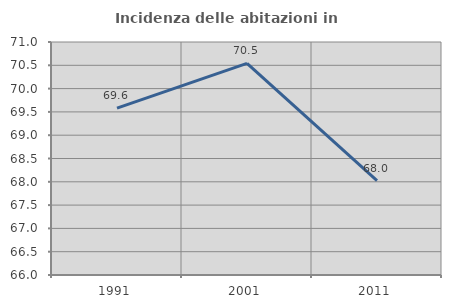
| Category | Incidenza delle abitazioni in proprietà  |
|---|---|
| 1991.0 | 69.58 |
| 2001.0 | 70.542 |
| 2011.0 | 68.024 |